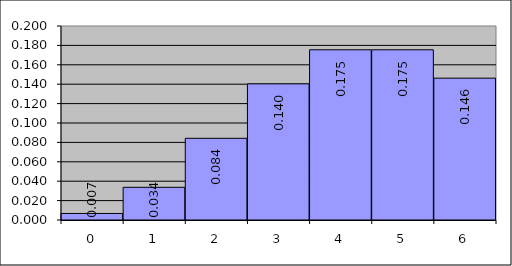
| Category | Series 0 |
|---|---|
| 0.0 | 0.007 |
| 1.0 | 0.034 |
| 2.0 | 0.084 |
| 3.0 | 0.14 |
| 4.0 | 0.175 |
| 5.0 | 0.175 |
| 6.0 | 0.146 |